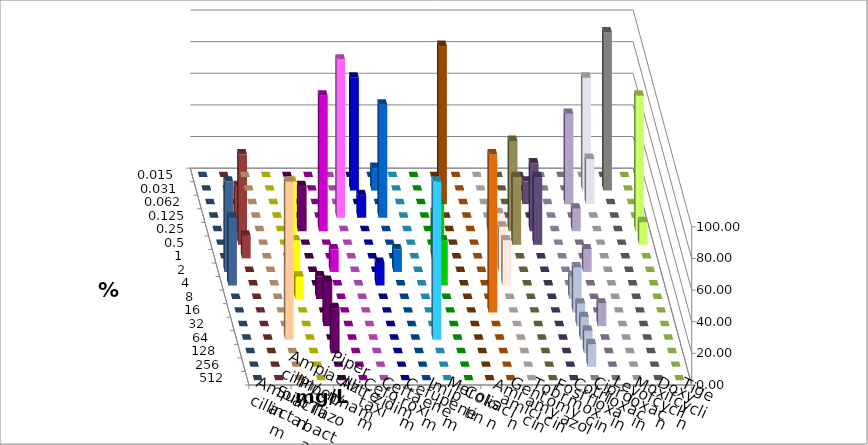
| Category | Ampicillin | Ampicillin/ Sulbactam | Piperacillin | Piperacillin/ Tazobactam | Aztreonam | Cefotaxim | Ceftazidim | Cefuroxim | Imipenem | Meropenem | Colistin | Amikacin | Gentamicin | Tobramycin | Fosfomycin | Cotrimoxazol | Ciprofloxacin | Levofloxacin | Moxifloxacin | Doxycyclin | Tigecyclin |
|---|---|---|---|---|---|---|---|---|---|---|---|---|---|---|---|---|---|---|---|---|---|
| 0.015 | 0 | 0 | 0 | 0 | 0 | 0 | 0 | 0 | 0 | 0 | 0 | 0 | 0 | 0 | 0 | 0 | 0 | 0 | 0 | 0 | 0 |
| 0.031 | 0 | 0 | 0 | 0 | 0 | 71.429 | 14.286 | 0 | 0 | 0 | 0 | 0 | 0 | 0 | 0 | 0 | 71.429 | 100 | 0 | 0 | 0 |
| 0.062 | 0 | 0 | 0 | 0 | 0 | 0 | 0 | 0 | 0 | 100 | 0 | 0 | 0 | 14.286 | 0 | 57.143 | 28.571 | 0 | 0 | 0 | 0 |
| 0.125 | 0 | 0 | 0 | 0 | 100 | 14.286 | 71.429 | 0 | 0 | 0 | 0 | 0 | 0 | 0 | 0 | 0 | 0 | 0 | 0 | 0 | 0 |
| 0.25 | 0 | 0 | 28.571 | 85.714 | 0 | 0 | 0 | 0 | 0 | 0 | 0 | 14.286 | 57.143 | 42.857 | 0 | 14.286 | 0 | 0 | 85.714 | 0 | 28.571 |
| 0.5 | 0 | 0 | 0 | 0 | 0 | 0 | 0 | 0 | 0 | 0 | 0 | 0 | 42.857 | 42.857 | 0 | 0 | 0 | 0 | 14.286 | 0 | 57.143 |
| 1.0 | 0 | 0 | 0 | 0 | 0 | 0 | 0 | 0 | 28.571 | 0 | 0 | 28.571 | 0 | 0 | 0 | 0 | 0 | 0 | 0 | 0 | 14.286 |
| 2.0 | 0 | 57.143 | 0 | 14.286 | 0 | 0 | 14.286 | 0 | 42.857 | 0 | 0 | 28.571 | 0 | 0 | 0 | 14.286 | 0 | 0 | 0 | 57.143 | 0 |
| 4.0 | 0 | 28.571 | 0 | 0 | 0 | 14.286 | 0 | 0 | 28.571 | 0 | 0 | 28.571 | 0 | 0 | 0 | 0 | 0 | 0 | 0 | 42.857 | 0 |
| 8.0 | 0 | 14.286 | 14.286 | 0 | 0 | 0 | 0 | 0 | 0 | 0 | 0 | 0 | 0 | 0 | 14.286 | 0 | 0 | 0 | 0 | 0 | 0 |
| 16.0 | 0 | 0 | 0 | 0 | 0 | 0 | 0 | 0 | 0 | 0 | 100 | 0 | 0 | 0 | 28.571 | 0 | 0 | 0 | 0 | 0 | 0 |
| 32.0 | 0 | 0 | 28.571 | 0 | 0 | 0 | 0 | 0 | 0 | 0 | 0 | 0 | 0 | 0 | 14.286 | 14.286 | 0 | 0 | 0 | 0 | 0 |
| 64.0 | 100 | 0 | 0 | 0 | 0 | 0 | 0 | 100 | 0 | 0 | 0 | 0 | 0 | 0 | 14.286 | 0 | 0 | 0 | 0 | 0 | 0 |
| 128.0 | 0 | 0 | 28.571 | 0 | 0 | 0 | 0 | 0 | 0 | 0 | 0 | 0 | 0 | 0 | 14.286 | 0 | 0 | 0 | 0 | 0 | 0 |
| 256.0 | 0 | 0 | 0 | 0 | 0 | 0 | 0 | 0 | 0 | 0 | 0 | 0 | 0 | 0 | 14.286 | 0 | 0 | 0 | 0 | 0 | 0 |
| 512.0 | 0 | 0 | 0 | 0 | 0 | 0 | 0 | 0 | 0 | 0 | 0 | 0 | 0 | 0 | 0 | 0 | 0 | 0 | 0 | 0 | 0 |